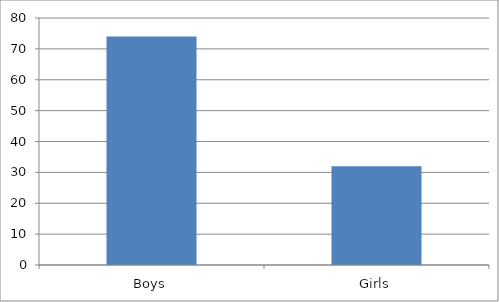
| Category | Series 0 |
|---|---|
| Boys | 74 |
| Girls | 32 |